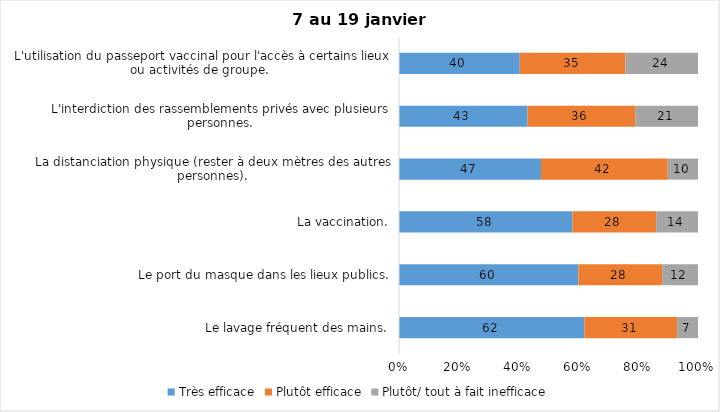
| Category | Très efficace | Plutôt efficace | Plutôt/ tout à fait inefficace |
|---|---|---|---|
| Le lavage fréquent des mains. | 62 | 31 | 7 |
| Le port du masque dans les lieux publics. | 60 | 28 | 12 |
| La vaccination. | 58 | 28 | 14 |
| La distanciation physique (rester à deux mètres des autres personnes). | 47 | 42 | 10 |
| L'interdiction des rassemblements privés avec plusieurs personnes. | 43 | 36 | 21 |
| L'utilisation du passeport vaccinal pour l'accès à certains lieux ou activités de groupe.  | 40 | 35 | 24 |